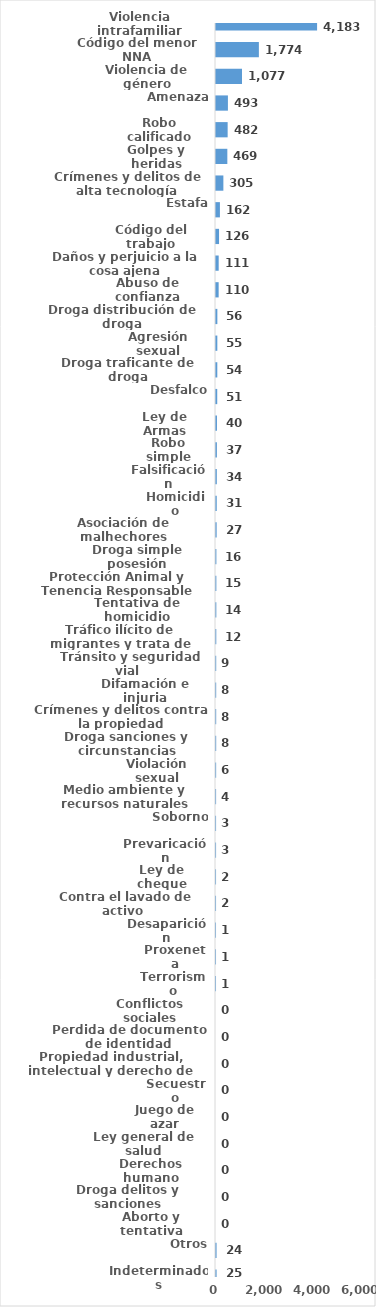
| Category | Series 0 |
|---|---|
| Violencia intrafamiliar | 4183 |
| Código del menor NNA | 1774 |
| Violencia de género | 1077 |
| Amenaza | 493 |
| Robo calificado | 482 |
| Golpes y heridas | 469 |
| Crímenes y delitos de alta tecnología | 305 |
| Estafa | 162 |
| Código del trabajo | 126 |
| Daños y perjuicio a la cosa ajena | 111 |
| Abuso de confianza | 110 |
| Droga distribución de droga | 56 |
| Agresión sexual | 55 |
| Droga traficante de droga | 54 |
| Desfalco | 51 |
| Ley de Armas | 40 |
| Robo simple | 37 |
| Falsificación | 34 |
| Homicidio | 31 |
| Asociación de malhechores | 27 |
| Droga simple posesión | 16 |
| Protección Animal y Tenencia Responsable | 15 |
| Tentativa de homicidio | 14 |
| Tráfico ilícito de migrantes y trata de personas | 12 |
| Tránsito y seguridad vial  | 9 |
| Difamación e injuria | 8 |
| Crímenes y delitos contra la propiedad | 8 |
| Droga sanciones y circunstancias agravantes | 8 |
| Violación sexual | 6 |
| Medio ambiente y recursos naturales | 4 |
| Soborno | 3 |
| Prevaricación | 3 |
| Ley de cheque | 2 |
| Contra el lavado de activo  | 2 |
| Desaparición | 1 |
| Proxeneta | 1 |
| Terrorismo | 1 |
| Conflictos sociales | 0 |
| Perdida de documento de identidad | 0 |
| Propiedad industrial, intelectual y derecho de autor | 0 |
| Secuestro | 0 |
| Juego de azar | 0 |
| Ley general de salud | 0 |
| Derechos humano | 0 |
| Droga delitos y sanciones | 0 |
| Aborto y tentativa | 0 |
| Otros | 24 |
| Indeterminados | 25 |